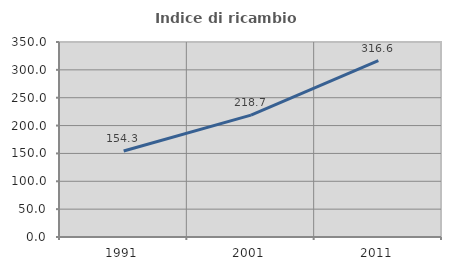
| Category | Indice di ricambio occupazionale  |
|---|---|
| 1991.0 | 154.257 |
| 2001.0 | 218.652 |
| 2011.0 | 316.614 |